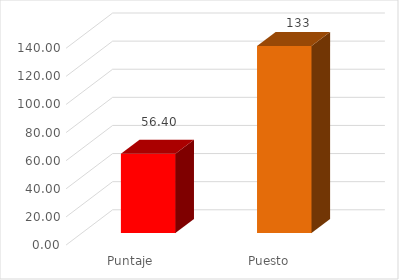
| Category | Series 0 |
|---|---|
| Puntaje  | 56.4 |
| Puesto | 133 |